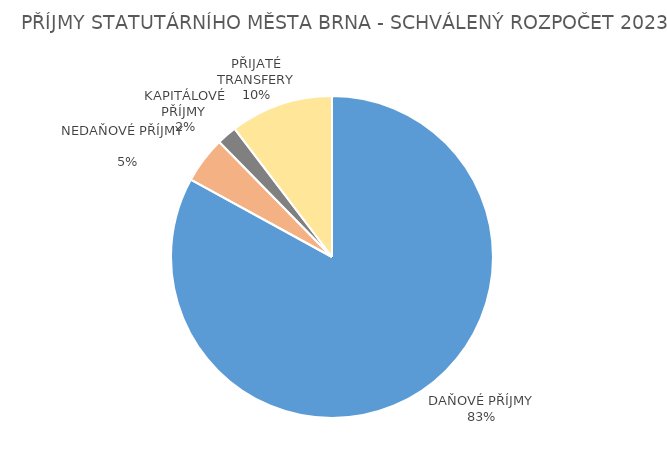
| Category | Series 0 |
|---|---|
| DAŇOVÉ PŘÍJMY | 14474.89 |
| NEDAŇOVÉ PŘÍJMY              | 817.293 |
| KAPITÁLOVÉ PŘÍJMY  | 350.655 |
| PŘIJATÉ TRANSFERY | 1803.599 |